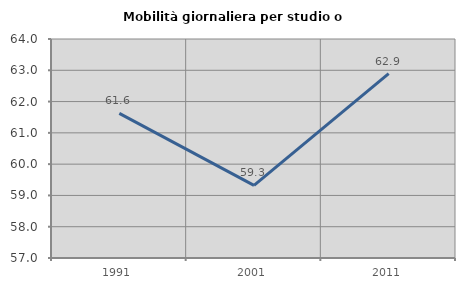
| Category | Mobilità giornaliera per studio o lavoro |
|---|---|
| 1991.0 | 61.621 |
| 2001.0 | 59.319 |
| 2011.0 | 62.895 |